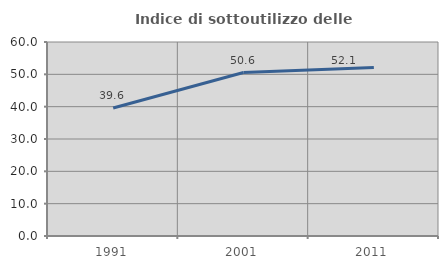
| Category | Indice di sottoutilizzo delle abitazioni  |
|---|---|
| 1991.0 | 39.583 |
| 2001.0 | 50.562 |
| 2011.0 | 52.113 |